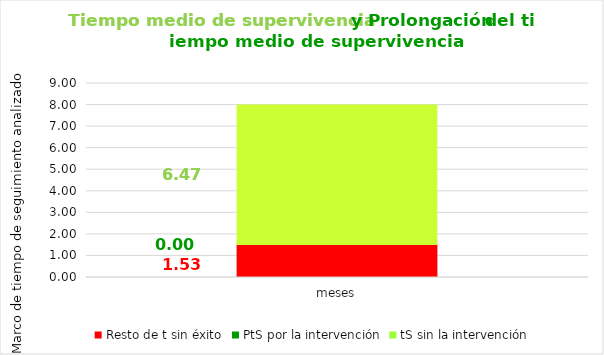
| Category | Resto de t sin éxito | PtS por la intervención | tS sin la intervención |
|---|---|---|---|
| meses | 1.529 | 0 | 6.471 |